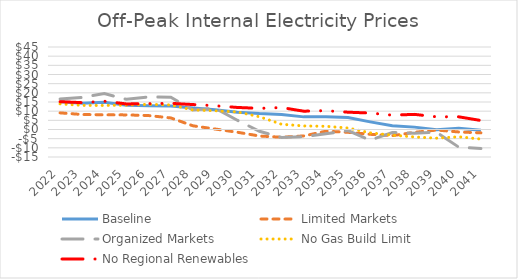
| Category | Baseline | Limited Markets | Organized Markets | No Gas Build Limit | No Regional Renewables |
|---|---|---|---|---|---|
| 2022.0 | 15.179 | 9.075 | 16.671 | 13.979 | 15.179 |
| 2023.0 | 14.363 | 8.171 | 17.509 | 13.155 | 14.652 |
| 2024.0 | 14.814 | 8.003 | 19.569 | 13.116 | 15.403 |
| 2025.0 | 13.218 | 7.971 | 16.444 | 13.291 | 13.942 |
| 2026.0 | 13.006 | 7.599 | 17.786 | 13.74 | 14.109 |
| 2027.0 | 12.752 | 6.316 | 17.639 | 13.414 | 14.277 |
| 2028.0 | 11.669 | 2.009 | 10.593 | 10.629 | 13.605 |
| 2029.0 | 10.792 | 0.262 | 11.611 | 10.229 | 12.963 |
| 2030.0 | 9.456 | -1.486 | 5.066 | 9.573 | 12.032 |
| 2031.0 | 8.667 | -3.552 | -0.978 | 6.967 | 11.529 |
| 2032.0 | 8.232 | -4.227 | -4.399 | 2.86 | 11.972 |
| 2033.0 | 6.891 | -3.505 | -3.933 | 1.949 | 9.984 |
| 2034.0 | 6.946 | -0.922 | -2.35 | 1.749 | 10.277 |
| 2035.0 | 6.547 | -1.527 | -0.563 | 0.809 | 9.437 |
| 2036.0 | 4.166 | -2.625 | -5.842 | -1.825 | 8.978 |
| 2037.0 | 2.022 | -3.367 | -1.633 | -3.078 | 7.831 |
| 2038.0 | 1.295 | -1.537 | -2.066 | -4.074 | 8.251 |
| 2039.0 | -0.067 | -0.31 | -1.505 | -4.715 | 6.909 |
| 2040.0 | 0.732 | -1.339 | -9.631 | -3.974 | 6.924 |
| 2041.0 | -0.437 | -1.832 | -10.43 | -5.234 | 4.892 |